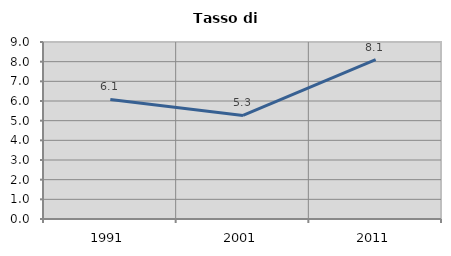
| Category | Tasso di disoccupazione   |
|---|---|
| 1991.0 | 6.078 |
| 2001.0 | 5.268 |
| 2011.0 | 8.1 |